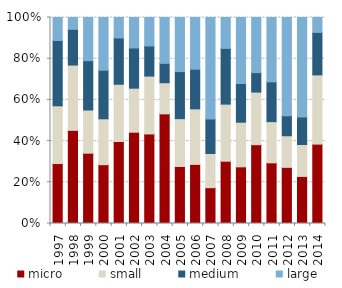
| Category | micro | small | medium | large |
|---|---|---|---|---|
| 1997.0 | 135000000 | 130000000 | 147000000 | 51800000 |
| 1998.0 | 134000000 | 93900000 | 51400000 | 17000000 |
| 1999.0 | 171000000 | 105000000 | 120000000 | 105000000 |
| 2000.0 | 155000000 | 121000000 | 128000000 | 139000000 |
| 2001.0 | 186000000 | 130000000 | 105000000 | 46400000 |
| 2002.0 | 178000000 | 85900000 | 78400000 | 59400000 |
| 2003.0 | 181000000 | 117000000 | 60800000 | 57600000 |
| 2004.0 | 373000000 | 106000000 | 65900000 | 156000000 |
| 2005.0 | 155000000 | 130000000 | 128000000 | 147000000 |
| 2006.0 | 167000000 | 157000000 | 112000000 | 146000000 |
| 2007.0 | 176000000 | 168000000 | 169000000 | 499000000 |
| 2008.0 | 180000000 | 165000000 | 161000000 | 89300000 |
| 2009.0 | 127000000 | 100000000 | 86600000 | 148000000 |
| 2010.0 | 111000000 | 74100000 | 27400000 | 77700000 |
| 2011.0 | 99900000 | 67900000 | 65500000 | 106000000 |
| 2012.0 | 78300000 | 44100000 | 27900000 | 137000000 |
| 2013.0 | 82700000 | 56100000 | 48100000 | 175000000 |
| 2014.0 | 78300000 | 68300000 | 41900000 | 14700000 |